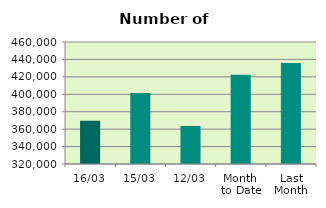
| Category | Series 0 |
|---|---|
| 16/03 | 369492 |
| 15/03 | 401470 |
| 12/03 | 363658 |
| Month 
to Date | 422433.5 |
| Last
Month | 435925.8 |